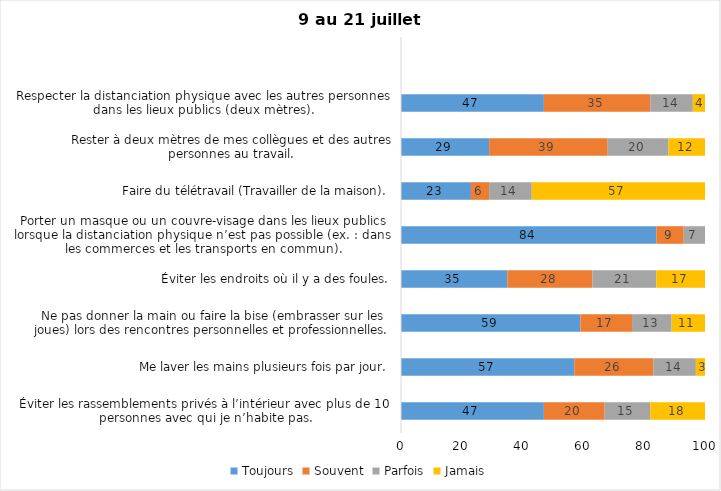
| Category | Toujours | Souvent | Parfois | Jamais |
|---|---|---|---|---|
| Éviter les rassemblements privés à l’intérieur avec plus de 10 personnes avec qui je n’habite pas. | 47 | 20 | 15 | 18 |
| Me laver les mains plusieurs fois par jour. | 57 | 26 | 14 | 3 |
| Ne pas donner la main ou faire la bise (embrasser sur les joues) lors des rencontres personnelles et professionnelles. | 59 | 17 | 13 | 11 |
| Éviter les endroits où il y a des foules. | 35 | 28 | 21 | 17 |
| Porter un masque ou un couvre-visage dans les lieux publics lorsque la distanciation physique n’est pas possible (ex. : dans les commerces et les transports en commun). | 84 | 9 | 7 | 0 |
| Faire du télétravail (Travailler de la maison). | 23 | 6 | 14 | 57 |
| Rester à deux mètres de mes collègues et des autres personnes au travail. | 29 | 39 | 20 | 12 |
| Respecter la distanciation physique avec les autres personnes dans les lieux publics (deux mètres). | 47 | 35 | 14 | 4 |